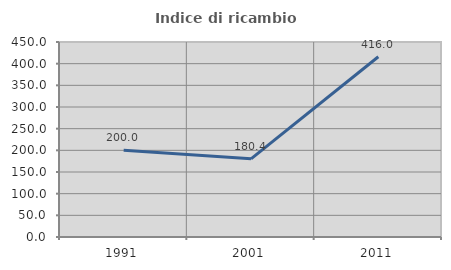
| Category | Indice di ricambio occupazionale  |
|---|---|
| 1991.0 | 200 |
| 2001.0 | 180.392 |
| 2011.0 | 416 |